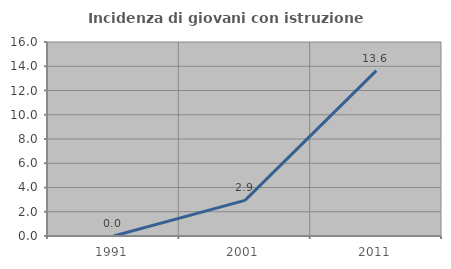
| Category | Incidenza di giovani con istruzione universitaria |
|---|---|
| 1991.0 | 0 |
| 2001.0 | 2.941 |
| 2011.0 | 13.636 |